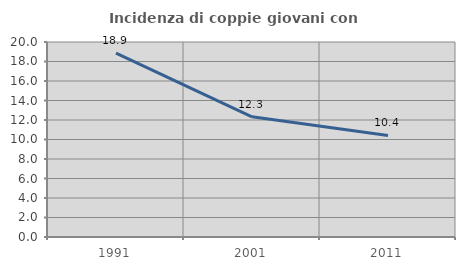
| Category | Incidenza di coppie giovani con figli |
|---|---|
| 1991.0 | 18.868 |
| 2001.0 | 12.323 |
| 2011.0 | 10.415 |